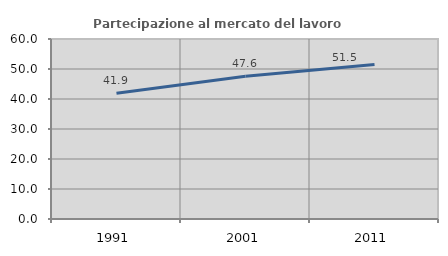
| Category | Partecipazione al mercato del lavoro  femminile |
|---|---|
| 1991.0 | 41.891 |
| 2001.0 | 47.597 |
| 2011.0 | 51.482 |